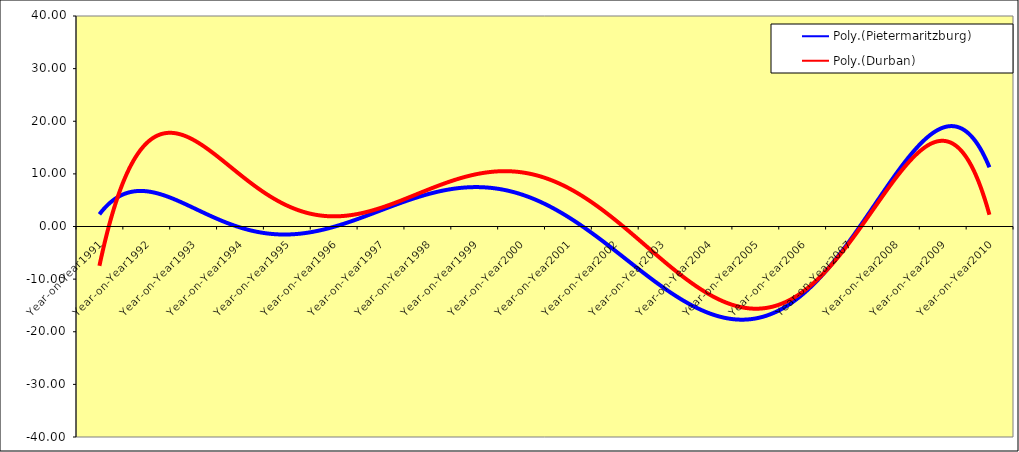
| Category | Pietermaritzburg | Durban |
|---|---|---|
| Year-on-Year1991 | 2.239 | -6.628 |
| Year-on-Year1992 | 5.869 | 8.596 |
| Year-on-Year1993 | 5.009 | 33.306 |
| Year-on-Year1994 | 0.521 | 0.362 |
| Year-on-Year1995 | -3.004 | -0.96 |
| Year-on-Year1996 | 3.49 | -10.367 |
| Year-on-Year1997 | 2.482 | 29.41 |
| Year-on-Year1998 | -8.601 | 6.445 |
| Year-on-Year1999 | 15.905 | 8.902 |
| Year-on-Year2000 | 5.48 | -4.268 |
| Year-on-Year2001 | 22.621 | -3.257 |
| Year-on-Year2002 | -9.94 | 21.643 |
| Year-on-Year2003 | -23.937 | -3.002 |
| Year-on-Year2004 | -35.923 | -7.906 |
| Year-on-Year2005 | 3.985 | -36.232 |
| Year-on-Year2006 | -9.935 | -10.284 |
| Year-on-Year2007 | -3.73 | 10.82 |
| Year-on-Year2008 | 10.7 | 1.391 |
| Year-on-Year2009 | 12.103 | 16.748 |
| Year-on-Year2010 | 14.302 | 2.495 |